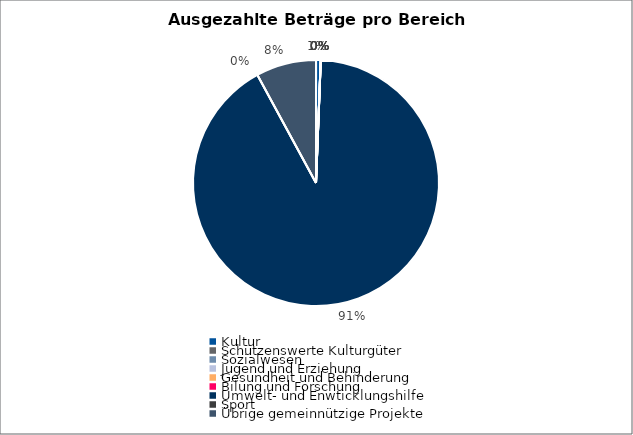
| Category | Series 0 |
|---|---|
| Kultur | 1000 |
| Schützenswerte Kulturgüter | 0 |
| Sozialwesen | 0 |
| Jugend und Erziehung | 0 |
| Gesundheit und Behinderung | 0 |
| Bilung und Forschung | 0 |
| Umwelt- und Enwticklungshilfe | 150000 |
| Sport | 0 |
| Übrige gemeinnützige Projekte | 13000 |